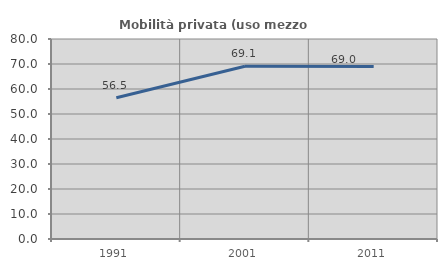
| Category | Mobilità privata (uso mezzo privato) |
|---|---|
| 1991.0 | 56.528 |
| 2001.0 | 69.106 |
| 2011.0 | 68.999 |